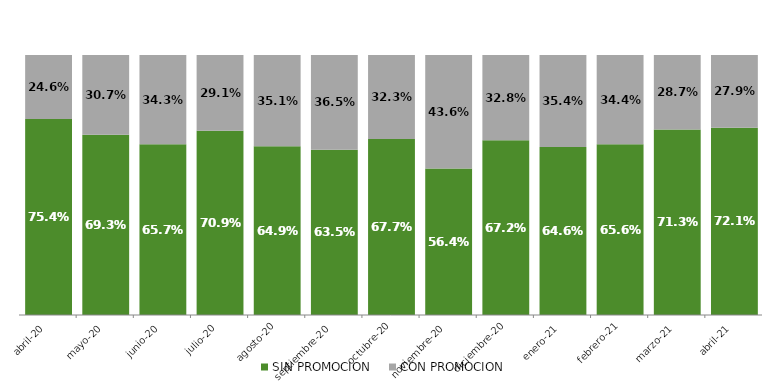
| Category | SIN PROMOCION   | CON PROMOCION   |
|---|---|---|
| 2020-04-01 | 0.754 | 0.246 |
| 2020-05-01 | 0.693 | 0.307 |
| 2020-06-01 | 0.657 | 0.343 |
| 2020-07-01 | 0.709 | 0.291 |
| 2020-08-01 | 0.649 | 0.351 |
| 2020-09-01 | 0.635 | 0.365 |
| 2020-10-01 | 0.677 | 0.323 |
| 2020-11-01 | 0.564 | 0.436 |
| 2020-12-01 | 0.672 | 0.328 |
| 2021-01-01 | 0.646 | 0.354 |
| 2021-02-01 | 0.656 | 0.344 |
| 2021-03-01 | 0.713 | 0.287 |
| 2021-04-01 | 0.721 | 0.279 |